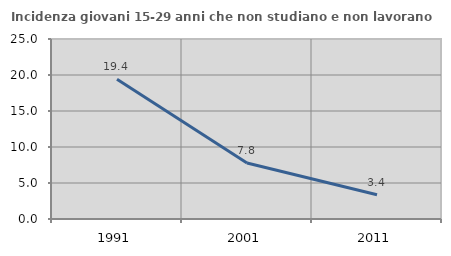
| Category | Incidenza giovani 15-29 anni che non studiano e non lavorano  |
|---|---|
| 1991.0 | 19.401 |
| 2001.0 | 7.772 |
| 2011.0 | 3.367 |